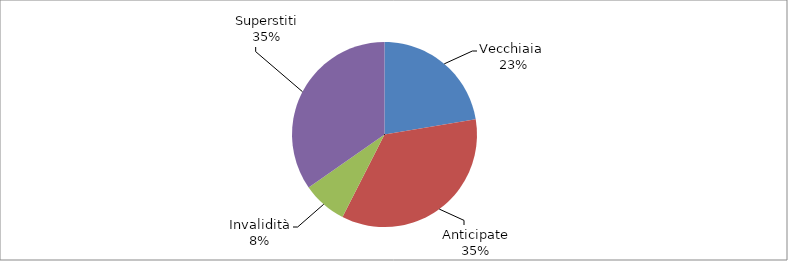
| Category | Series 0 |
|---|---|
| Vecchiaia  | 58501 |
| Anticipate | 92058 |
| Invalidità | 20424 |
| Superstiti | 90836 |